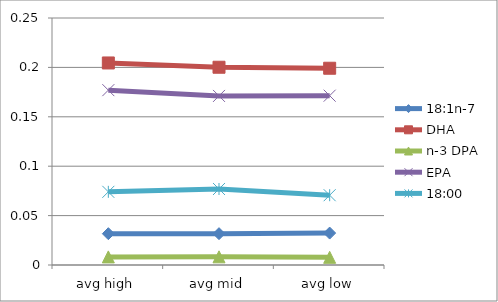
| Category | 18:1n-7 | DHA | n-3 DPA | EPA | 18:00 |
|---|---|---|---|---|---|
| avg high | 0.032 | 0.204 | 0.008 | 0.177 | 0.074 |
| avg mid | 0.032 | 0.2 | 0.008 | 0.171 | 0.077 |
| avg low | 0.032 | 0.199 | 0.008 | 0.171 | 0.071 |